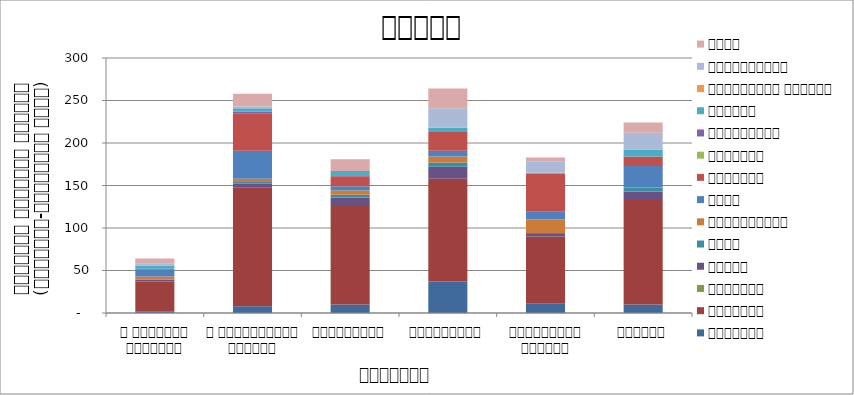
| Category | सुरक्षा | राजनीति | आन्दोलन | न्याय | शासन | अर्थतन्त्र | समाज | कुटनीति | वातावरण | स्वास्थ्य  | शिक्षा | प्राकृतिक प्रकोप | भ्रष्टाचार | अन्य |
|---|---|---|---|---|---|---|---|---|---|---|---|---|---|---|
| द हिमालयन टाइम्स् | 2 | 35 | 0 | 2 | 0 | 4 | 8 | 1 | 0 | 0 | 4 | 0 | 2 | 6 |
| द काठमाण्डौं पोस्ट् | 8 | 140 | 0 | 4 | 2 | 4 | 33 | 44 | 0 | 2 | 4 | 0 | 2 | 15 |
| रिपब्लिका | 10 | 116 | 0 | 10 | 3 | 5 | 5 | 12 | 0 | 1 | 5 | 0 | 0 | 14 |
| कान्तिपुर | 37 | 121 | 0 | 14 | 5 | 7 | 7 | 22 | 0 | 0 | 5 | 0 | 23 | 23 |
| अन्नपूर्ण पोस्ट् | 11 | 79 | 0 | 3 | 1 | 16 | 9 | 45 | 0 | 0 | 1 | 0 | 13 | 5 |
| नागरिक | 10 | 124 | 0 | 9 | 4 | 1 | 25 | 11 | 0 | 0 | 8 | 0 | 20 | 12 |